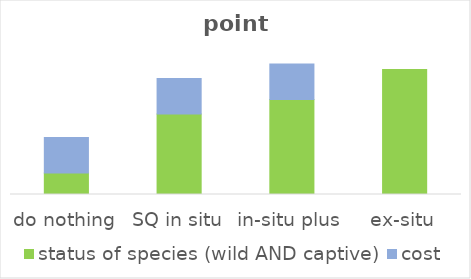
| Category | status of species (wild AND captive) | cost |
|---|---|---|
| do nothing | 0.101 | 0.167 |
| SQ in situ | 0.379 | 0.167 |
| in-situ plus | 0.446 | 0.167 |
| ex-situ | 0.587 | 0 |